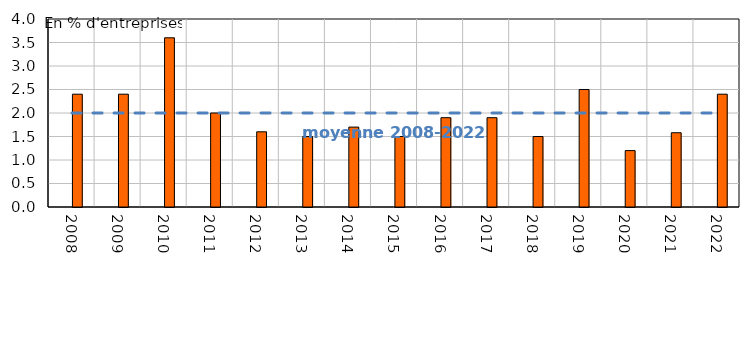
| Category | Taux de grève | Series 1 |
|---|---|---|
| 2008.0 |  | 2.4 |
| 2009.0 |  | 2.4 |
| 2010.0 |  | 3.6 |
| 2011.0 |  | 2 |
| 2012.0 |  | 1.6 |
| 2013.0 |  | 1.5 |
| 2014.0 |  | 1.7 |
| 2015.0 |  | 1.5 |
| 2016.0 |  | 1.9 |
| 2017.0 |  | 1.9 |
| 2018.0 |  | 1.5 |
| 2019.0 |  | 2.5 |
| 2020.0 |  | 1.2 |
| 2021.0 |  | 1.58 |
| 2022.0 |  | 2.4 |